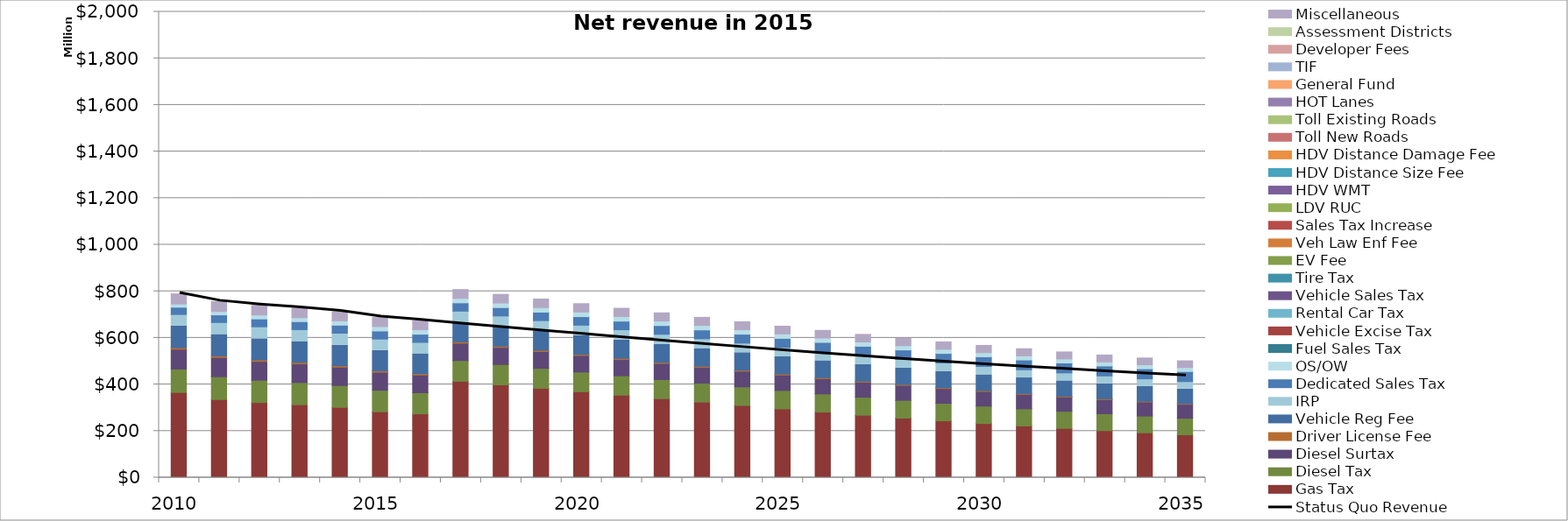
| Category | Gas Tax | Diesel Tax | Diesel Surtax | Driver License Fee | Vehicle Reg Fee | IRP | Dedicated Sales Tax | OS/OW | Fuel Sales Tax | Vehicle Excise Tax | Rental Car Tax | Vehicle Sales Tax | Tire Tax | EV Fee | Veh Law Enf Fee | Sales Tax Increase | LDV RUC | HDV WMT | HDV Distance Size Fee | HDV Distance Damage Fee | Toll New Roads | Toll Existing Roads | HOT Lanes | General Fund | TIF | Developer Fees | Assessment Districts | Miscellaneous |
|---|---|---|---|---|---|---|---|---|---|---|---|---|---|---|---|---|---|---|---|---|---|---|---|---|---|---|---|---|
| 2010.0 | 365803467.597 | 100737488.288 | 84480722.938 | 7238563.841 | 93398984.345 | 48964330.276 | 31126844.809 | 13792753.804 | 0 | 0 | 0 | 0 | 0 | 0 | 0 | 0 | 0 | 0 | 0 | 0 | 0 | 0 | 0 | 0 | 0 | 0 | 0 | 43446075.375 |
| 2011.0 | 335403177.917 | 98101675.674 | 82269898.533 | 7009331.971 | 92044582.2 | 51356839.24 | 32641127.149 | 14702584.452 | 0 | 0 | 0 | 0 | 0 | 0 | 0 | 0 | 0 | 0 | 0 | 0 | 0 | 0 | 0 | 0 | 0 | 0 | 0 | 42386415 |
| 2012.0 | 322655774.648 | 95905345.567 | 80423106.071 | 6703612.314 | 90653665.423 | 51306154.153 | 33850812.65 | 17137076.564 | 0 | 0 | 0 | 0 | 0 | 0 | 0 | 0 | 0 | 0 | 0 | 0 | 0 | 0 | 0 | 0 | 0 | 0 | 0 | 41352600 |
| 2013.0 | 313125288.509 | 95366628.612 | 79971084.116 | 6461679.772 | 89503447.439 | 51111582.582 | 34365432.976 | 16756776.055 | 0 | 0 | 0 | 0 | 0 | 0 | 0 | 0 | 0 | 0 | 0 | 0 | 0 | 0 | 0 | 0 | 0 | 0 | 0 | 40344000 |
| 2014.0 | 301794431.198 | 93792438.507 | 78653218.191 | 6281670.773 | 88199634.277 | 51550705.354 | 34352434.178 | 18594417.254 | 0 | 0 | 0 | 0 | 0 | 0 | 0 | 0 | 0 | 0 | 0 | 0 | 0 | 0 | 0 | 0 | 0 | 0 | 0 | 39360000 |
| 2015.0 | 283015760.15 | 92214265.278 | 77330111.805 | 6169471.962 | 86799065.999 | 49573166.946 | 34709004.589 | 18999667.964 | 0 | 0 | 0 | 0 | 0 | 0 | 0 | 0 | 0 | 0 | 0 | 0 | 0 | 0 | 0 | 0 | 0 | 0 | 0 | 38784000 |
| 2016.0 | 273921397.29 | 90688631.181 | 76050982.186 | 5999346.787 | 85419788.63 | 48695609.333 | 35210101.19 | 19164292.938 | 0 | 0 | 0 | 0 | 0 | 0 | 0 | 0 | 0 | 0 | 0 | 0 | 0 | 0 | 0 | 0 | 0 | 0 | 0 | 38216429.268 |
| 2017.0 | 413809844.413 | 88885358.579 | 74539053.568 | 5832017.51 | 84060384.986 | 47869320.47 | 35581391.785 | 19410173.649 | 0 | 0 | 0 | 0 | 0 | 0 | 0 | 0 | 0 | 0 | 0 | 0 | 0 | 0 | 0 | 0 | 0 | 0 | 0 | 37657164.45 |
| 2018.0 | 398617525.652 | 87209968.827 | 73134364.676 | 5667430.499 | 82719109.037 | 46884114.546 | 35963581.581 | 19604103.909 | 0 | 0 | 0 | 0 | 0 | 0 | 0 | 0 | 0 | 0 | 0 | 0 | 0 | 0 | 0 | 0 | 0 | 0 | 0 | 37106083.994 |
| 2019.0 | 383735031.676 | 85753104.265 | 71912908.304 | 5505533.101 | 81397361.18 | 45896750.927 | 36419260.803 | 19657795.415 | 0 | 0 | 0 | 0 | 0 | 0 | 0 | 0 | 0 | 0 | 0 | 0 | 0 | 0 | 0 | 0 | 0 | 0 | 0 | 36563068.131 |
| 2020.0 | 369056787.327 | 84390694.658 | 70770652.171 | 5346273.618 | 80094532.922 | 44912573.78 | 36823762.69 | 19649272.163 | 0 | 0 | 0 | 0 | 0 | 0 | 0 | 0 | 0 | 0 | 0 | 0 | 0 | 0 | 0 | 0 | 0 | 0 | 0 | 36027998.841 |
| 2021.0 | 354244728.19 | 83117290.123 | 69703026.421 | 5188659.878 | 78810041.125 | 43935623.828 | 37150843.888 | 19585506.975 | 0 | 0 | 0 | 0 | 0 | 0 | 0 | 0 | 0 | 0 | 0 | 0 | 0 | 0 | 0 | 0 | 0 | 0 | 0 | 35500759.834 |
| 2022.0 | 339403319.025 | 81940282.468 | 68716228.397 | 5033639.262 | 77543185.144 | 42968845.828 | 37514094.3 | 19478202.83 | 0 | 0 | 0 | 0 | 0 | 0 | 0 | 0 | 0 | 0 | 0 | 0 | 0 | 0 | 0 | 0 | 0 | 0 | 0 | 34981236.519 |
| 2023.0 | 324623704.394 | 80860935.876 | 67811317.793 | 4881161.48 | 76293771.757 | 42014345.547 | 37957959.888 | 19335660.095 | 0 | 0 | 0 | 0 | 0 | 0 | 0 | 0 | 0 | 0 | 0 | 0 | 0 | 0 | 0 | 0 | 0 | 0 | 0 | 34469315.985 |
| 2024.0 | 309922715.838 | 79862209.016 | 66974005.709 | 4731177.168 | 75061137.272 | 41073559.808 | 38423603.46 | 19164438.033 | 0 | 0 | 0 | 0 | 0 | 0 | 0 | 0 | 0 | 0 | 0 | 0 | 0 | 0 | 0 | 0 | 0 | 0 | 0 | 33964886.97 |
| 2025.0 | 295415063.071 | 78921052.081 | 66184965.325 | 4583637.866 | 73844637.988 | 40147477.107 | 38895597.977 | 18969748.516 | 0 | 0 | 0 | 0 | 0 | 0 | 0 | 0 | 0 | 0 | 0 | 0 | 0 | 0 | 0 | 0 | 0 | 0 | 0 | 33467839.844 |
| 2026.0 | 281503489.28 | 78016969.925 | 65427011.837 | 4437744.654 | 72643859.433 | 39236791.392 | 39398972.485 | 18755809.865 | 0 | 0 | 0 | 0 | 0 | 0 | 0 | 0 | 0 | 0 | 0 | 0 | 0 | 0 | 0 | 0 | 0 | 0 | 0 | 32978066.578 |
| 2027.0 | 268283744.69 | 77144464.67 | 64695535.264 | 4294250.364 | 71458776.744 | 38342046.85 | 39936382.666 | 18526110.346 | 0 | 0 | 0 | 0 | 0 | 0 | 0 | 0 | 0 | 0 | 0 | 0 | 0 | 0 | 0 | 0 | 0 | 0 | 0 | 32495460.726 |
| 2028.0 | 255730938.786 | 76303032.187 | 63990112.771 | 4153107.982 | 70289032.369 | 37463638.149 | 40444892.562 | 18283551.377 | 0 | 0 | 0 | 0 | 0 | 0 | 0 | 0 | 0 | 0 | 0 | 0 | 0 | 0 | 0 | 0 | 0 | 0 | 0 | 32019917.398 |
| 2029.0 | 243819182.317 | 75486146.122 | 63305272.07 | 4014271.366 | 69134768.463 | 36601788.925 | 40967223.938 | 18030541.945 | 0 | 0 | 0 | 0 | 0 | 0 | 0 | 0 | 0 | 0 | 0 | 0 | 0 | 0 | 0 | 0 | 0 | 0 | 0 | 31551333.241 |
| 2030.0 | 232518750.979 | 74705598.038 | 62650899.99 | 3877695.23 | 67996071.929 | 35756717.229 | 41524666.051 | 17769158.767 | 0 | 0 | 0 | 0 | 0 | 0 | 0 | 0 | 0 | 0 | 0 | 0 | 0 | 0 | 0 | 0 | 0 | 0 | 0 | 31089606.413 |
| 2031.0 | 221803656.088 | 73951149.148 | 62018411.493 | 3742953.305 | 66872480.74 | 34928432.57 | 42062698.342 | 17501107.054 | 0 | 0 | 0 | 0 | 0 | 0 | 0 | 0 | 0 | 0 | 0 | 0 | 0 | 0 | 0 | 0 | 0 | 0 | 0 | 30634636.563 |
| 2032.0 | 211646155.319 | 73220748.688 | 61406086.994 | 3610410.6 | 65764274.601 | 34116921.761 | 42632651.186 | 17227858.629 | 0 | 0 | 0 | 0 | 0 | 0 | 0 | 0 | 0 | 0 | 0 | 0 | 0 | 0 | 0 | 0 | 0 | 0 | 0 | 30186324.808 |
| 2033.0 | 201975672.146 | 72505825.056 | 60806725.534 | 3480023.646 | 64671132.504 | 33344378.797 | 42873449.295 | 17155268.502 | 0 | 0 | 0 | 0 | 0 | 0 | 0 | 0 | 0 | 0 | 0 | 0 | 0 | 0 | 0 | 0 | 0 | 0 | 0 | 29744573.714 |
| 2034.0 | 192765217.192 | 71816344.195 | 60228696.371 | 3351749.786 | 63593358.189 | 32589370.679 | 43115607.483 | 17083005.935 | 0 | 0 | 0 | 0 | 0 | 0 | 0 | 0 | 0 | 0 | 0 | 0 | 0 | 0 | 0 | 0 | 0 | 0 | 0 | 29309287.269 |
| 2035.0 | 183995216.573 | 71148298.363 | 59668639.13 | 3225547.155 | 62530799.159 | 31851483.126 | 43359133.431 | 17011061.17 | 0 | 0 | 0 | 0 | 0 | 0 | 0 | 0 | 0 | 0 | 0 | 0 | 0 | 0 | 0 | 0 | 0 | 0 | 0 | 28880370.87 |